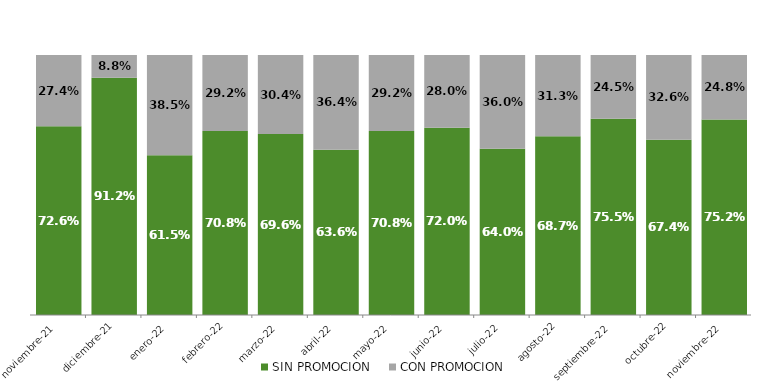
| Category | SIN PROMOCION   | CON PROMOCION   |
|---|---|---|
| 2021-11-01 | 0.726 | 0.274 |
| 2021-12-01 | 0.912 | 0.088 |
| 2022-01-01 | 0.615 | 0.385 |
| 2022-02-01 | 0.708 | 0.292 |
| 2022-03-01 | 0.696 | 0.304 |
| 2022-04-01 | 0.636 | 0.364 |
| 2022-05-01 | 0.708 | 0.292 |
| 2022-06-01 | 0.72 | 0.28 |
| 2022-07-01 | 0.64 | 0.36 |
| 2022-08-01 | 0.687 | 0.313 |
| 2022-09-01 | 0.755 | 0.245 |
| 2022-10-01 | 0.674 | 0.326 |
| 2022-11-01 | 0.752 | 0.248 |